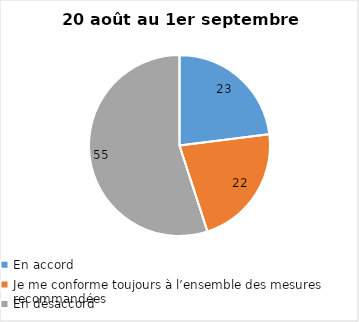
| Category | Series 0 |
|---|---|
| En accord | 23 |
| Je me conforme toujours à l’ensemble des mesures recommandées | 22 |
| En désaccord | 55 |